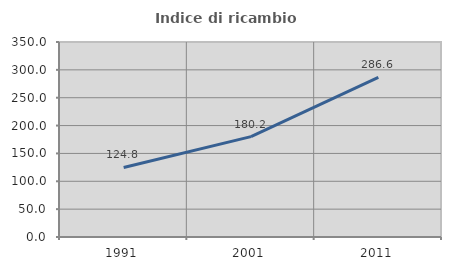
| Category | Indice di ricambio occupazionale  |
|---|---|
| 1991.0 | 124.812 |
| 2001.0 | 180.18 |
| 2011.0 | 286.614 |